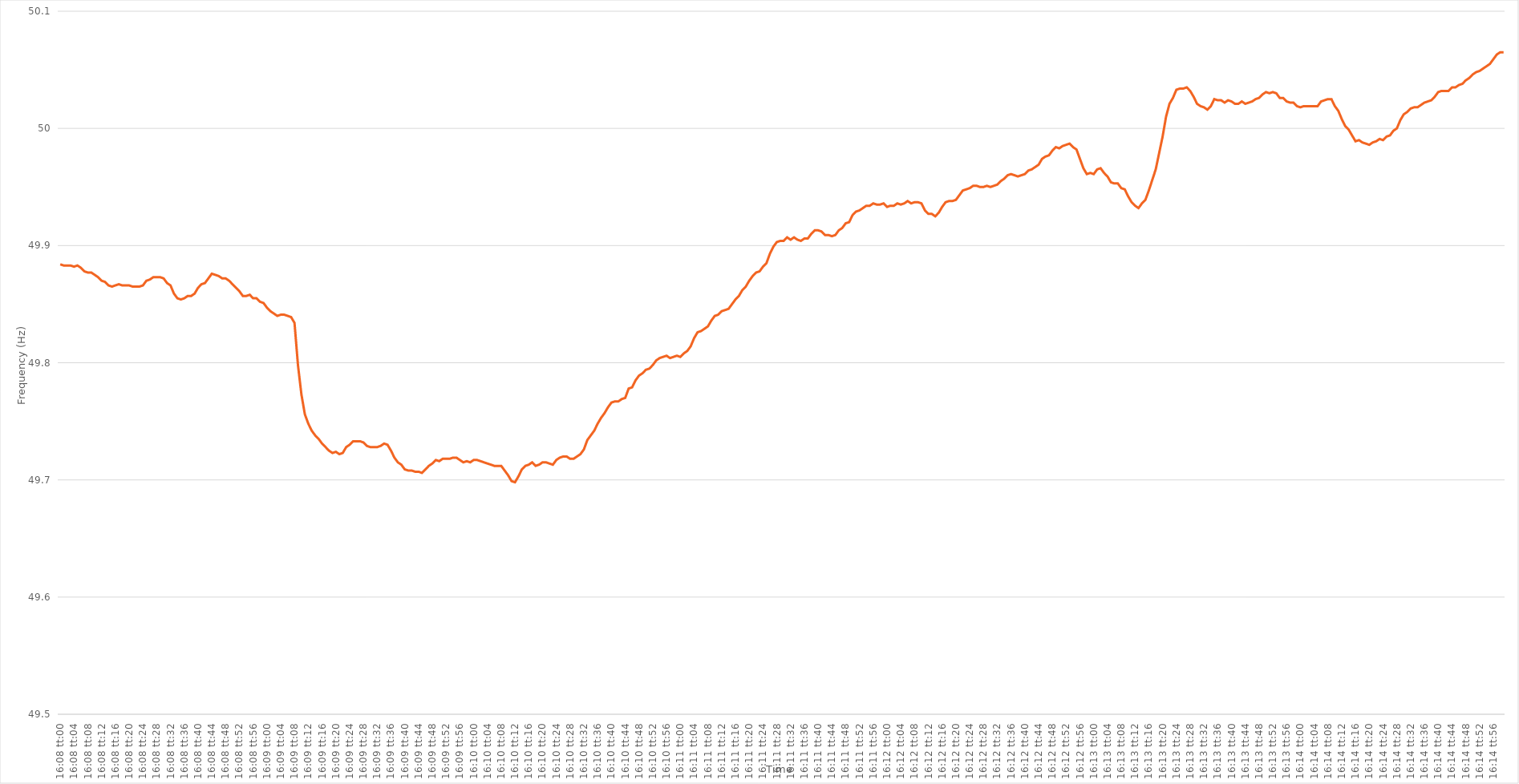
| Category | Series 0 |
|---|---|
| 0.6722222222222222 | 49.884 |
| 0.6722337962962963 | 49.883 |
| 0.6722453703703705 | 49.883 |
| 0.6722569444444444 | 49.883 |
| 0.6722685185185185 | 49.882 |
| 0.6722800925925926 | 49.883 |
| 0.6722916666666667 | 49.881 |
| 0.6723032407407407 | 49.878 |
| 0.6723148148148148 | 49.877 |
| 0.672326388888889 | 49.877 |
| 0.672337962962963 | 49.875 |
| 0.672349537037037 | 49.873 |
| 0.6723611111111111 | 49.87 |
| 0.6723726851851852 | 49.869 |
| 0.6723842592592592 | 49.866 |
| 0.6723958333333333 | 49.865 |
| 0.6724074074074075 | 49.866 |
| 0.6724189814814815 | 49.867 |
| 0.6724305555555555 | 49.866 |
| 0.6724421296296296 | 49.866 |
| 0.6724537037037037 | 49.866 |
| 0.6724652777777779 | 49.865 |
| 0.6724768518518518 | 49.865 |
| 0.672488425925926 | 49.865 |
| 0.6725 | 49.866 |
| 0.6725115740740741 | 49.87 |
| 0.6725231481481481 | 49.871 |
| 0.6725347222222222 | 49.873 |
| 0.6725462962962964 | 49.873 |
| 0.6725578703703704 | 49.873 |
| 0.6725694444444444 | 49.872 |
| 0.6725810185185185 | 49.868 |
| 0.6725925925925926 | 49.866 |
| 0.6726041666666666 | 49.859 |
| 0.6726157407407407 | 49.855 |
| 0.6726273148148149 | 49.854 |
| 0.6726388888888889 | 49.855 |
| 0.6726504629629629 | 49.857 |
| 0.672662037037037 | 49.857 |
| 0.6726736111111111 | 49.859 |
| 0.6726851851851853 | 49.864 |
| 0.6726967592592592 | 49.867 |
| 0.6727083333333334 | 49.868 |
| 0.6727199074074074 | 49.872 |
| 0.6727314814814815 | 49.876 |
| 0.6727430555555555 | 49.875 |
| 0.6727546296296296 | 49.874 |
| 0.6727662037037038 | 49.872 |
| 0.6727777777777778 | 49.872 |
| 0.6727893518518518 | 49.87 |
| 0.6728009259259259 | 49.867 |
| 0.6728125 | 49.864 |
| 0.672824074074074 | 49.861 |
| 0.6728356481481481 | 49.857 |
| 0.6728472222222223 | 49.857 |
| 0.6728587962962963 | 49.858 |
| 0.6728703703703703 | 49.855 |
| 0.6728819444444444 | 49.855 |
| 0.6728935185185185 | 49.852 |
| 0.6729050925925927 | 49.851 |
| 0.6729166666666666 | 49.847 |
| 0.6729282407407408 | 49.844 |
| 0.6729398148148148 | 49.842 |
| 0.672951388888889 | 49.84 |
| 0.6729629629629629 | 49.841 |
| 0.672974537037037 | 49.841 |
| 0.6729861111111112 | 49.84 |
| 0.6729976851851852 | 49.839 |
| 0.6730092592592593 | 49.834 |
| 0.6730208333333333 | 49.798 |
| 0.6730324074074074 | 49.773 |
| 0.6730439814814816 | 49.756 |
| 0.6730555555555555 | 49.748 |
| 0.6730671296296297 | 49.742 |
| 0.6730787037037037 | 49.738 |
| 0.6730902777777777 | 49.735 |
| 0.6731018518518518 | 49.731 |
| 0.6731134259259259 | 49.728 |
| 0.6731250000000001 | 49.725 |
| 0.673136574074074 | 49.723 |
| 0.6731481481481482 | 49.724 |
| 0.6731597222222222 | 49.722 |
| 0.6731712962962964 | 49.723 |
| 0.6731828703703703 | 49.728 |
| 0.6731944444444444 | 49.73 |
| 0.6732060185185186 | 49.733 |
| 0.6732175925925926 | 49.733 |
| 0.6732291666666667 | 49.733 |
| 0.6732407407407407 | 49.732 |
| 0.6732523148148148 | 49.729 |
| 0.673263888888889 | 49.728 |
| 0.6732754629629629 | 49.728 |
| 0.6732870370370371 | 49.728 |
| 0.6732986111111111 | 49.729 |
| 0.6733101851851852 | 49.731 |
| 0.6733217592592592 | 49.73 |
| 0.6733333333333333 | 49.725 |
| 0.6733449074074075 | 49.719 |
| 0.6733564814814814 | 49.715 |
| 0.6733680555555556 | 49.713 |
| 0.6733796296296296 | 49.709 |
| 0.6733912037037038 | 49.708 |
| 0.6734027777777777 | 49.708 |
| 0.6734143518518518 | 49.707 |
| 0.673425925925926 | 49.707 |
| 0.6734375 | 49.706 |
| 0.6734490740740741 | 49.709 |
| 0.6734606481481481 | 49.712 |
| 0.6734722222222222 | 49.714 |
| 0.6734837962962964 | 49.717 |
| 0.6734953703703703 | 49.716 |
| 0.6735069444444445 | 49.718 |
| 0.6735185185185185 | 49.718 |
| 0.6735300925925927 | 49.718 |
| 0.6735416666666666 | 49.719 |
| 0.6735532407407407 | 49.719 |
| 0.6735648148148149 | 49.717 |
| 0.6735763888888888 | 49.715 |
| 0.673587962962963 | 49.716 |
| 0.673599537037037 | 49.715 |
| 0.6736111111111112 | 49.717 |
| 0.6736226851851851 | 49.717 |
| 0.6736342592592592 | 49.716 |
| 0.6736458333333334 | 49.715 |
| 0.6736574074074074 | 49.714 |
| 0.6736689814814815 | 49.713 |
| 0.6736805555555555 | 49.712 |
| 0.6736921296296297 | 49.712 |
| 0.6737037037037038 | 49.712 |
| 0.6737152777777777 | 49.708 |
| 0.6737268518518519 | 49.704 |
| 0.6737384259259259 | 49.699 |
| 0.6737500000000001 | 49.698 |
| 0.673761574074074 | 49.703 |
| 0.6737731481481481 | 49.709 |
| 0.6737847222222223 | 49.712 |
| 0.6737962962962962 | 49.713 |
| 0.6738078703703704 | 49.715 |
| 0.6738194444444444 | 49.712 |
| 0.6738310185185186 | 49.713 |
| 0.6738425925925925 | 49.715 |
| 0.6738541666666666 | 49.715 |
| 0.6738657407407408 | 49.714 |
| 0.6738773148148148 | 49.713 |
| 0.6738888888888889 | 49.717 |
| 0.6739004629629629 | 49.719 |
| 0.6739120370370371 | 49.72 |
| 0.6739236111111112 | 49.72 |
| 0.6739351851851851 | 49.718 |
| 0.6739467592592593 | 49.718 |
| 0.6739583333333333 | 49.72 |
| 0.6739699074074075 | 49.722 |
| 0.6739814814814814 | 49.726 |
| 0.6739930555555556 | 49.734 |
| 0.6740046296296297 | 49.738 |
| 0.6740162037037036 | 49.742 |
| 0.6740277777777778 | 49.748 |
| 0.6740393518518518 | 49.753 |
| 0.674050925925926 | 49.757 |
| 0.6740624999999999 | 49.762 |
| 0.674074074074074 | 49.766 |
| 0.6740856481481482 | 49.767 |
| 0.6740972222222222 | 49.767 |
| 0.6741087962962963 | 49.769 |
| 0.6741203703703703 | 49.77 |
| 0.6741319444444445 | 49.778 |
| 0.6741435185185186 | 49.779 |
| 0.6741550925925925 | 49.785 |
| 0.6741666666666667 | 49.789 |
| 0.6741782407407407 | 49.791 |
| 0.6741898148148149 | 49.794 |
| 0.6742013888888888 | 49.795 |
| 0.674212962962963 | 49.798 |
| 0.6742245370370371 | 49.802 |
| 0.6742361111111111 | 49.804 |
| 0.6742476851851852 | 49.805 |
| 0.6742592592592592 | 49.806 |
| 0.6742708333333334 | 49.804 |
| 0.6742824074074073 | 49.805 |
| 0.6742939814814815 | 49.806 |
| 0.6743055555555556 | 49.805 |
| 0.6743171296296296 | 49.808 |
| 0.6743287037037037 | 49.81 |
| 0.6743402777777777 | 49.814 |
| 0.6743518518518519 | 49.821 |
| 0.674363425925926 | 49.826 |
| 0.674375 | 49.827 |
| 0.6743865740740741 | 49.829 |
| 0.6743981481481481 | 49.831 |
| 0.6744097222222223 | 49.836 |
| 0.6744212962962962 | 49.84 |
| 0.6744328703703704 | 49.841 |
| 0.6744444444444445 | 49.844 |
| 0.6744560185185186 | 49.845 |
| 0.6744675925925926 | 49.846 |
| 0.6744791666666666 | 49.85 |
| 0.6744907407407408 | 49.854 |
| 0.6745023148148147 | 49.857 |
| 0.6745138888888889 | 49.862 |
| 0.674525462962963 | 49.865 |
| 0.674537037037037 | 49.87 |
| 0.6745486111111111 | 49.874 |
| 0.6745601851851851 | 49.877 |
| 0.6745717592592593 | 49.878 |
| 0.6745833333333334 | 49.882 |
| 0.6745949074074074 | 49.885 |
| 0.6746064814814815 | 49.893 |
| 0.6746180555555555 | 49.899 |
| 0.6746296296296297 | 49.903 |
| 0.6746412037037036 | 49.904 |
| 0.6746527777777778 | 49.904 |
| 0.6746643518518519 | 49.907 |
| 0.674675925925926 | 49.905 |
| 0.6746875 | 49.907 |
| 0.674699074074074 | 49.905 |
| 0.6747106481481482 | 49.904 |
| 0.6747222222222221 | 49.906 |
| 0.6747337962962963 | 49.906 |
| 0.6747453703703704 | 49.91 |
| 0.6747569444444445 | 49.913 |
| 0.6747685185185185 | 49.913 |
| 0.6747800925925925 | 49.912 |
| 0.6747916666666667 | 49.909 |
| 0.6748032407407408 | 49.909 |
| 0.6748148148148148 | 49.908 |
| 0.6748263888888889 | 49.909 |
| 0.674837962962963 | 49.913 |
| 0.6748495370370371 | 49.915 |
| 0.674861111111111 | 49.919 |
| 0.6748726851851852 | 49.92 |
| 0.6748842592592593 | 49.926 |
| 0.6748958333333334 | 49.929 |
| 0.6749074074074074 | 49.93 |
| 0.6749189814814814 | 49.932 |
| 0.6749305555555556 | 49.934 |
| 0.6749421296296297 | 49.934 |
| 0.6749537037037037 | 49.936 |
| 0.6749652777777778 | 49.935 |
| 0.6749768518518519 | 49.935 |
| 0.6749884259259259 | 49.936 |
| 0.6749999999999999 | 49.933 |
| 0.6750115740740741 | 49.934 |
| 0.6750231481481482 | 49.934 |
| 0.6750347222222222 | 49.936 |
| 0.6750462962962963 | 49.935 |
| 0.6750578703703703 | 49.936 |
| 0.6750694444444445 | 49.938 |
| 0.6750810185185184 | 49.936 |
| 0.6750925925925926 | 49.937 |
| 0.6751041666666667 | 49.937 |
| 0.6751157407407408 | 49.936 |
| 0.6751273148148148 | 49.93 |
| 0.6751388888888888 | 49.927 |
| 0.675150462962963 | 49.927 |
| 0.6751620370370371 | 49.925 |
| 0.6751736111111111 | 49.928 |
| 0.6751851851851852 | 49.933 |
| 0.6751967592592593 | 49.937 |
| 0.6752083333333333 | 49.938 |
| 0.6752199074074073 | 49.938 |
| 0.6752314814814815 | 49.939 |
| 0.6752430555555556 | 49.943 |
| 0.6752546296296296 | 49.947 |
| 0.6752662037037037 | 49.948 |
| 0.6752777777777778 | 49.949 |
| 0.6752893518518519 | 49.951 |
| 0.6753009259259258 | 49.951 |
| 0.6753125 | 49.95 |
| 0.6753240740740741 | 49.95 |
| 0.6753356481481482 | 49.951 |
| 0.6753472222222222 | 49.95 |
| 0.6753587962962962 | 49.951 |
| 0.6753703703703704 | 49.952 |
| 0.6753819444444445 | 49.955 |
| 0.6753935185185185 | 49.957 |
| 0.6754050925925926 | 49.96 |
| 0.6754166666666667 | 49.961 |
| 0.6754282407407407 | 49.96 |
| 0.6754398148148147 | 49.959 |
| 0.6754513888888889 | 49.96 |
| 0.675462962962963 | 49.961 |
| 0.675474537037037 | 49.964 |
| 0.6754861111111111 | 49.965 |
| 0.6754976851851852 | 49.967 |
| 0.6755092592592593 | 49.969 |
| 0.6755208333333332 | 49.974 |
| 0.6755324074074074 | 49.976 |
| 0.6755439814814815 | 49.977 |
| 0.6755555555555556 | 49.981 |
| 0.6755671296296296 | 49.984 |
| 0.6755787037037037 | 49.983 |
| 0.6755902777777778 | 49.985 |
| 0.675601851851852 | 49.986 |
| 0.6756134259259259 | 49.987 |
| 0.675625 | 49.984 |
| 0.6756365740740741 | 49.982 |
| 0.6756481481481482 | 49.974 |
| 0.6756597222222221 | 49.966 |
| 0.6756712962962963 | 49.961 |
| 0.6756828703703704 | 49.962 |
| 0.6756944444444444 | 49.961 |
| 0.6757060185185185 | 49.965 |
| 0.6757175925925926 | 49.966 |
| 0.6757291666666667 | 49.962 |
| 0.6757407407407406 | 49.959 |
| 0.6757523148148148 | 49.954 |
| 0.6757638888888889 | 49.953 |
| 0.675775462962963 | 49.953 |
| 0.675787037037037 | 49.949 |
| 0.6757986111111111 | 49.948 |
| 0.6758101851851852 | 49.942 |
| 0.6758217592592594 | 49.937 |
| 0.6758333333333333 | 49.934 |
| 0.6758449074074074 | 49.932 |
| 0.6758564814814815 | 49.936 |
| 0.6758680555555556 | 49.939 |
| 0.6758796296296296 | 49.947 |
| 0.6758912037037037 | 49.956 |
| 0.6759027777777779 | 49.965 |
| 0.6759143518518518 | 49.979 |
| 0.6759259259259259 | 49.993 |
| 0.6759375 | 50.01 |
| 0.6759490740740741 | 50.021 |
| 0.675960648148148 | 50.026 |
| 0.6759722222222222 | 50.033 |
| 0.6759837962962963 | 50.034 |
| 0.6759953703703704 | 50.034 |
| 0.6760069444444444 | 50.035 |
| 0.6760185185185185 | 50.032 |
| 0.6760300925925926 | 50.027 |
| 0.6760416666666668 | 50.021 |
| 0.6760532407407407 | 50.019 |
| 0.6760648148148148 | 50.018 |
| 0.6760763888888889 | 50.016 |
| 0.676087962962963 | 50.019 |
| 0.676099537037037 | 50.025 |
| 0.6761111111111111 | 50.024 |
| 0.6761226851851853 | 50.024 |
| 0.6761342592592593 | 50.022 |
| 0.6761458333333333 | 50.024 |
| 0.6761574074074074 | 50.023 |
| 0.6761689814814815 | 50.021 |
| 0.6761805555555555 | 50.021 |
| 0.6761921296296296 | 50.023 |
| 0.6762037037037038 | 50.021 |
| 0.6762152777777778 | 50.022 |
| 0.6762268518518518 | 50.023 |
| 0.6762384259259259 | 50.025 |
| 0.67625 | 50.026 |
| 0.6762615740740742 | 50.029 |
| 0.6762731481481481 | 50.031 |
| 0.6762847222222222 | 50.03 |
| 0.6762962962962963 | 50.031 |
| 0.6763078703703704 | 50.03 |
| 0.6763194444444444 | 50.026 |
| 0.6763310185185185 | 50.026 |
| 0.6763425925925927 | 50.023 |
| 0.6763541666666667 | 50.022 |
| 0.6763657407407407 | 50.022 |
| 0.6763773148148148 | 50.019 |
| 0.6763888888888889 | 50.018 |
| 0.6764004629629629 | 50.019 |
| 0.676412037037037 | 50.019 |
| 0.6764236111111112 | 50.019 |
| 0.6764351851851852 | 50.019 |
| 0.6764467592592592 | 50.019 |
| 0.6764583333333333 | 50.023 |
| 0.6764699074074074 | 50.024 |
| 0.6764814814814816 | 50.025 |
| 0.6764930555555555 | 50.025 |
| 0.6765046296296297 | 50.019 |
| 0.6765162037037037 | 50.015 |
| 0.6765277777777778 | 50.008 |
| 0.6765393518518518 | 50.002 |
| 0.6765509259259259 | 49.999 |
| 0.6765625000000001 | 49.994 |
| 0.6765740740740741 | 49.989 |
| 0.6765856481481481 | 49.99 |
| 0.6765972222222222 | 49.988 |
| 0.6766087962962963 | 49.987 |
| 0.6766203703703703 | 49.986 |
| 0.6766319444444444 | 49.988 |
| 0.6766435185185186 | 49.989 |
| 0.6766550925925926 | 49.991 |
| 0.6766666666666666 | 49.99 |
| 0.6766782407407407 | 49.993 |
| 0.6766898148148148 | 49.994 |
| 0.676701388888889 | 49.998 |
| 0.6767129629629629 | 50 |
| 0.676724537037037 | 50.007 |
| 0.6767361111111111 | 50.012 |
| 0.6767476851851852 | 50.014 |
| 0.6767592592592592 | 50.017 |
| 0.6767708333333333 | 50.018 |
| 0.6767824074074075 | 50.018 |
| 0.6767939814814815 | 50.02 |
| 0.6768055555555555 | 50.022 |
| 0.6768171296296296 | 50.023 |
| 0.6768287037037037 | 50.024 |
| 0.6768402777777779 | 50.027 |
| 0.6768518518518518 | 50.031 |
| 0.676863425925926 | 50.032 |
| 0.676875 | 50.032 |
| 0.676886574074074 | 50.032 |
| 0.6768981481481481 | 50.035 |
| 0.6769097222222222 | 50.035 |
| 0.6769212962962964 | 50.037 |
| 0.6769328703703703 | 50.038 |
| 0.6769444444444445 | 50.041 |
| 0.6769560185185185 | 50.043 |
| 0.6769675925925926 | 50.046 |
| 0.6769791666666666 | 50.048 |
| 0.6769907407407407 | 50.049 |
| 0.6770023148148149 | 50.051 |
| 0.6770138888888889 | 50.053 |
| 0.677025462962963 | 50.055 |
| 0.677037037037037 | 50.059 |
| 0.6770486111111111 | 50.063 |
| 0.6770601851851853 | 50.065 |
| 0.6770717592592592 | 50.065 |